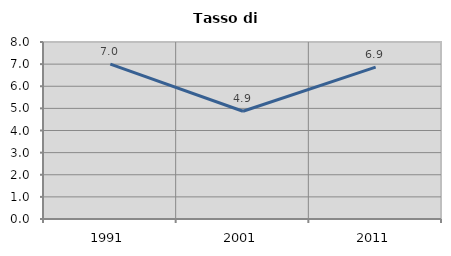
| Category | Tasso di disoccupazione   |
|---|---|
| 1991.0 | 6.998 |
| 2001.0 | 4.871 |
| 2011.0 | 6.867 |